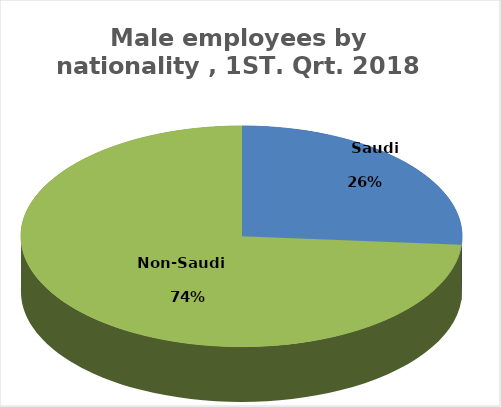
| Category | Series 0 |
|---|---|
|        Saudi      | 1586037 |
|          Non-Saudi        | 4460983 |